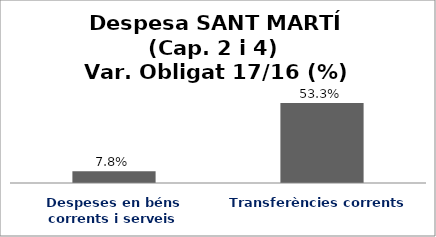
| Category | Series 0 |
|---|---|
| Despeses en béns corrents i serveis | 0.078 |
| Transferències corrents | 0.533 |